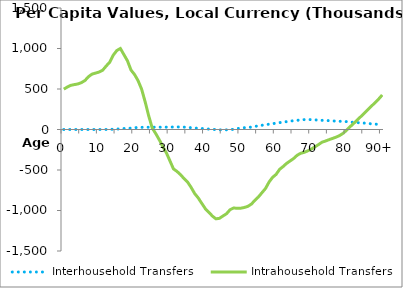
| Category | Interhousehold Transfers | Intrahousehold Transfers |
|---|---|---|
| 0 | 0 | 498271.26 |
|  | 0 | 524114.28 |
| 2 | 0 | 545400.14 |
| 3 | 0 | 554450.33 |
| 4 | 0 | 562540.54 |
| 5 | 0 | 578968.02 |
| 6 | 0 | 605388.87 |
| 7 | 0 | 652623.47 |
| 8 | 0 | 684016.83 |
| 9 | 0 | 696696.01 |
| 10 | 0 | 709538.61 |
| 11 | 0 | 732105.67 |
| 12 | 686.567 | 784329.47 |
| 13 | 1456.384 | 831220.74 |
| 14 | 3047.423 | 918653.5 |
| 15 | 5413.082 | 975244.2 |
| 16 | 8690.573 | 1000065.3 |
| 17 | 11881.188 | 923859.59 |
| 18 | 14488.315 | 847981.57 |
| 19 | 17645.58 | 733985.27 |
| 20 | 21866.955 | 678880.32 |
| 21 | 25084.254 | 603061.09 |
| 22 | 26527.638 | 497906.55 |
| 23 | 27079.092 | 341559.13 |
| 24 | 27546.837 | 169103.57 |
| 25 | 28222.256 | 18134.254 |
| 26 | 28615.211 | -50878.725 |
| 27 | 28781.995 | -127855.56 |
| 28 | 28889.513 | -212652.6 |
| 29 | 28908.577 | -288288.88 |
| 30 | 29741.487 | -387063.95 |
| 31 | 30703.184 | -486206.46 |
| 32 | 31623.303 | -517892.9 |
| 33 | 31288.037 | -557383.16 |
| 34 | 29298.939 | -606958.32 |
| 35 | 26167.006 | -648918.97 |
| 36 | 22322.902 | -715660.58 |
| 37 | 18816.215 | -791176.67 |
| 38 | 15282.372 | -844826.13 |
| 39 | 11846.282 | -911969.49 |
| 40 | 8464.766 | -977648.57 |
| 41 | 5259.55 | -1022589.3 |
| 42 | 2028.205 | -1068670.8 |
| 43 | -796.41 | -1102978.7 |
| 44 | -3958.838 | -1096823.6 |
| 45 | -4771.902 | -1067638.3 |
| 46 | -4435.646 | -1039434.1 |
| 47 | -2740.159 | -990191.68 |
| 48 | 3296.032 | -968670.14 |
| 49 | 10790.751 | -972907.72 |
| 50 | 17159.839 | -971532.58 |
| 51 | 21929.353 | -962831.06 |
| 52 | 24259.22 | -949371.88 |
| 53 | 29618.667 | -921441.63 |
| 54 | 38245.462 | -875753.88 |
| 55 | 45594.4 | -833333.17 |
| 56 | 52455.368 | -780739.54 |
| 57 | 59677.058 | -729319.71 |
| 58 | 64766.679 | -649768.41 |
| 59 | 71498.408 | -591387.42 |
| 60 | 78557.901 | -554204.49 |
| 61 | 84556.724 | -491828.7 |
| 62 | 90634.505 | -456654.66 |
| 63 | 97503 | -417438.58 |
| 64 | 103462.34 | -387489.67 |
| 65 | 109178.37 | -356535.8 |
| 66 | 113816.74 | -316617.67 |
| 67 | 118348.92 | -293113.84 |
| 68 | 122150.58 | -281301.23 |
| 69 | 123481.01 | -262906.34 |
| 70 | 121146.04 | -240730.68 |
| 71 | 118516.75 | -213648.19 |
| 72 | 116132.51 | -185948.15 |
| 73 | 113207.94 | -156122.19 |
| 74 | 111099.07 | -141698.37 |
| 75 | 109196.42 | -125039.37 |
| 76 | 105736.97 | -109590.8 |
| 77 | 103777.04 | -93490.205 |
| 78 | 101496.24 | -73593.269 |
| 79 | 99285.009 | -45300.635 |
| 80 | 96799.876 | -5481.004 |
| 81 | 91229.075 | 37751.097 |
| 82 | 88227.221 | 77821.334 |
| 83 | 85096.597 | 119438.19 |
| 84 | 81871.031 | 161753.11 |
| 85 | 78613.685 | 203306.51 |
| 86 | 74951.394 | 246407.37 |
| 87 | 69336.146 | 290250.14 |
| 88 | 66382.178 | 333074.84 |
| 89 | 63620.631 | 376454.73 |
| 90+ | 61095.16 | 426714.32 |